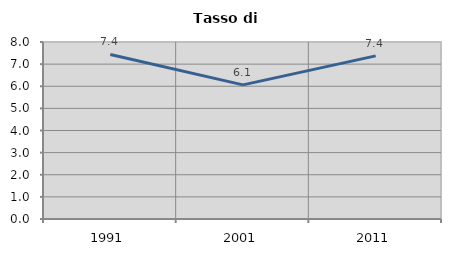
| Category | Tasso di disoccupazione   |
|---|---|
| 1991.0 | 7.437 |
| 2001.0 | 6.061 |
| 2011.0 | 7.373 |